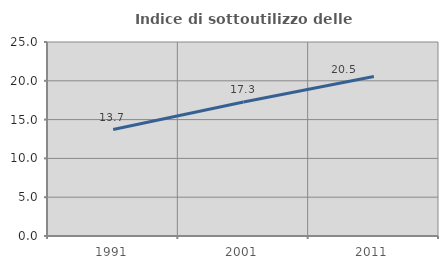
| Category | Indice di sottoutilizzo delle abitazioni  |
|---|---|
| 1991.0 | 13.714 |
| 2001.0 | 17.262 |
| 2011.0 | 20.544 |